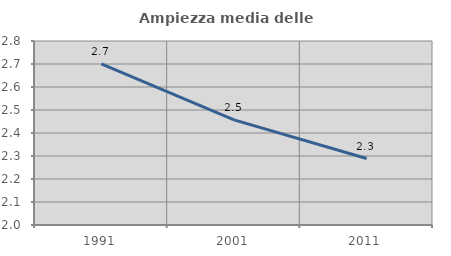
| Category | Ampiezza media delle famiglie |
|---|---|
| 1991.0 | 2.7 |
| 2001.0 | 2.457 |
| 2011.0 | 2.289 |